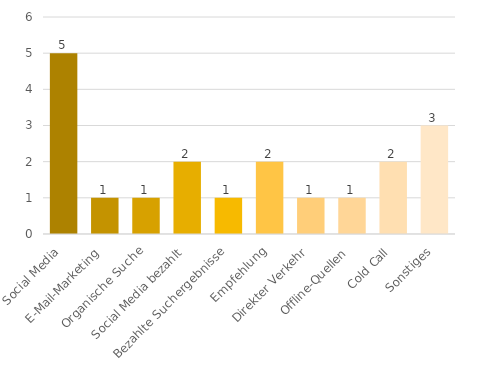
| Category | Series 0 |
|---|---|
| Social Media | 5 |
| E-Mail-Marketing | 1 |
| Organische Suche | 1 |
| Social Media bezahlt | 2 |
| Bezahlte Suchergebnisse | 1 |
| Empfehlung | 2 |
| Direkter Verkehr | 1 |
| Offline-Quellen | 1 |
| Cold Call | 2 |
| Sonstiges | 3 |